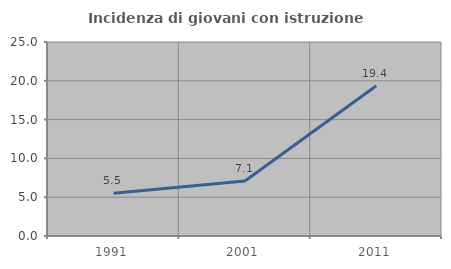
| Category | Incidenza di giovani con istruzione universitaria |
|---|---|
| 1991.0 | 5.505 |
| 2001.0 | 7.092 |
| 2011.0 | 19.372 |